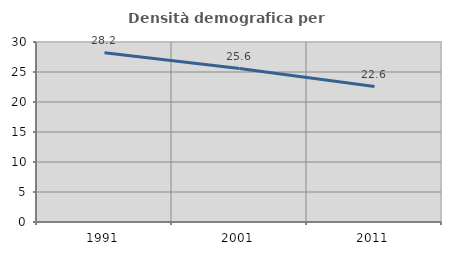
| Category | Densità demografica |
|---|---|
| 1991.0 | 28.192 |
| 2001.0 | 25.582 |
| 2011.0 | 22.572 |